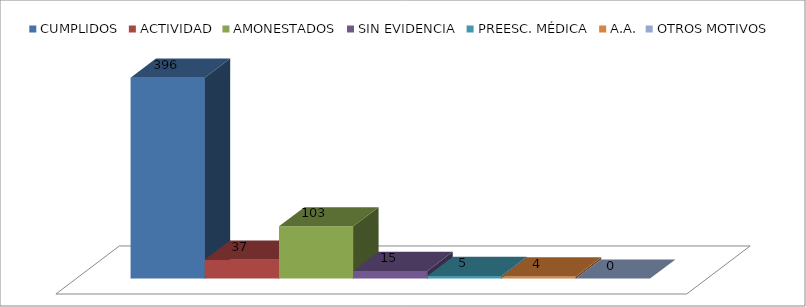
| Category | CUMPLIDOS | ACTIVIDAD | AMONESTADOS | SIN EVIDENCIA | PREESC. MÉDICA | A.A. | OTROS MOTIVOS |
|---|---|---|---|---|---|---|---|
| 0 | 396 | 37 | 103 | 15 | 5 | 4 | 0 |